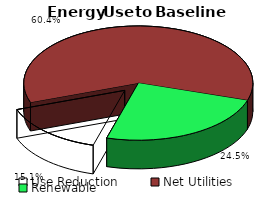
| Category | Series 0 |
|---|---|
| Use Reduction | 0.151 |
| Net Utilities | 0.604 |
| Renewable | 0.245 |